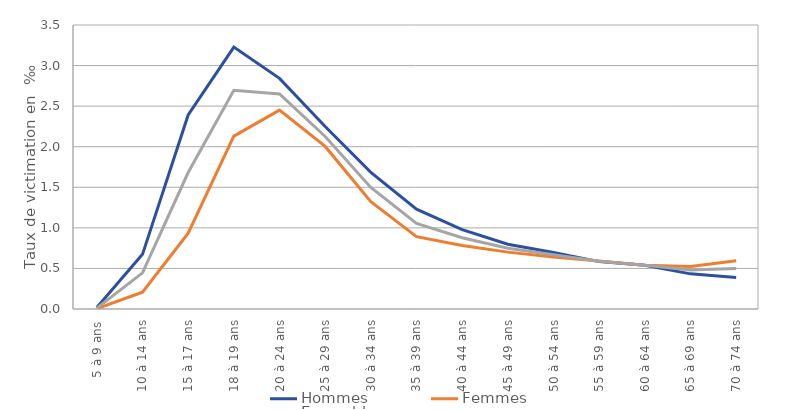
| Category | Hommes | Femmes | Ensemble |
|---|---|---|---|
| 5 à 9 ans | 0.017 | 0.005 | 0.011 |
| 10 à 14 ans | 0.674 | 0.207 | 0.446 |
| 15 à 17 ans | 2.392 | 0.934 | 1.682 |
| 18 à 19 ans | 3.227 | 2.131 | 2.695 |
| 20 à 24 ans | 2.842 | 2.451 | 2.65 |
| 25 à 29 ans | 2.25 | 2.003 | 2.126 |
| 30 à 34 ans | 1.683 | 1.324 | 1.499 |
| 35 à 39 ans | 1.229 | 0.892 | 1.056 |
| 40 à 44 ans | 0.977 | 0.784 | 0.879 |
| 45 à 49 ans | 0.799 | 0.701 | 0.749 |
| 50 à 54 ans | 0.696 | 0.64 | 0.667 |
| 55 à 59 ans | 0.584 | 0.591 | 0.588 |
| 60 à 64 ans | 0.538 | 0.54 | 0.539 |
| 65 à 69 ans | 0.433 | 0.525 | 0.482 |
| 70 à 74 ans | 0.389 | 0.596 | 0.5 |